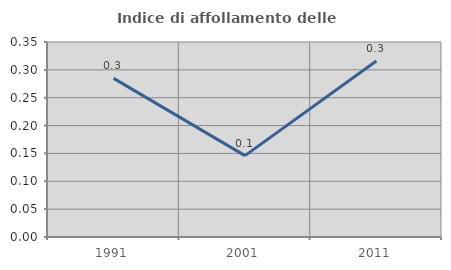
| Category | Indice di affollamento delle abitazioni  |
|---|---|
| 1991.0 | 0.285 |
| 2001.0 | 0.146 |
| 2011.0 | 0.316 |